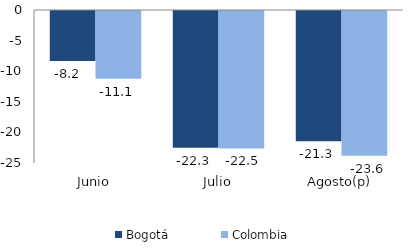
| Category | Bogotá | Colombia |
|---|---|---|
| Junio | -8.165 | -11.077 |
| Julio | -22.325 | -22.462 |
| Agosto(p) | -21.286 | -23.647 |